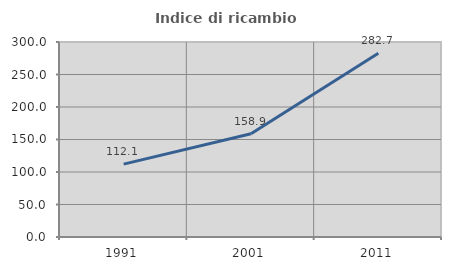
| Category | Indice di ricambio occupazionale  |
|---|---|
| 1991.0 | 112.143 |
| 2001.0 | 158.863 |
| 2011.0 | 282.684 |